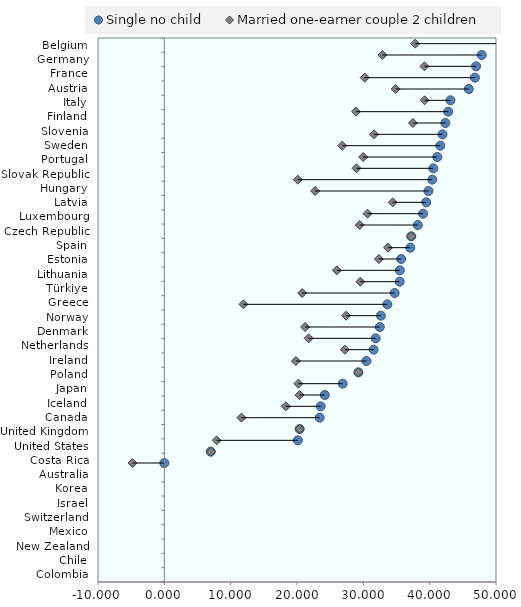
| Category | blankName |
|---|---|
| Colombia | -4.797 |
| Chile | 7 |
| New Zealand | 7.891 |
| Mexico | 20.402 |
| Switzerland | 11.623 |
| Israel | 18.32 |
| Korea | 20.372 |
| Australia | 20.206 |
| Costa Rica | 29.249 |
| United States | 19.843 |
| United Kingdom | 27.214 |
| Canada | 21.752 |
| Iceland | 21.221 |
| Japan | 27.405 |
| Poland | 11.923 |
| Ireland | 20.78 |
| Netherlands | 29.553 |
| Denmark | 26.008 |
| Norway | 32.346 |
| Greece | 33.721 |
| Türkiye | 37.224 |
| Lithuania | 29.451 |
| Estonia | 30.627 |
| Spain | 34.427 |
| Czech Republic | 22.733 |
| Luxembourg | 20.122 |
| Latvia | 28.965 |
| Hungary | 29.974 |
| Slovak Republic | 26.824 |
| Portugal | 31.611 |
| Sweden | 37.479 |
| Slovenia | 28.897 |
| Finland | 39.237 |
| Italy | 34.871 |
| Austria | 30.206 |
| France | 39.21 |
| Germany | 32.875 |
| Belgium | 37.82 |